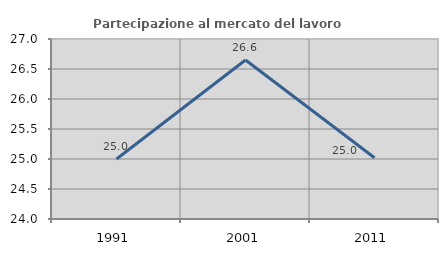
| Category | Partecipazione al mercato del lavoro  femminile |
|---|---|
| 1991.0 | 25 |
| 2001.0 | 26.649 |
| 2011.0 | 25.021 |